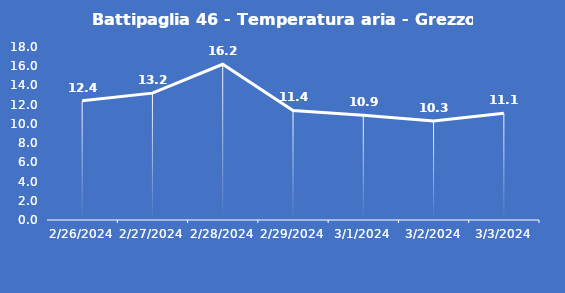
| Category | Battipaglia 46 - Temperatura aria - Grezzo (°C) |
|---|---|
| 2/26/24 | 12.4 |
| 2/27/24 | 13.2 |
| 2/28/24 | 16.2 |
| 2/29/24 | 11.4 |
| 3/1/24 | 10.9 |
| 3/2/24 | 10.3 |
| 3/3/24 | 11.1 |